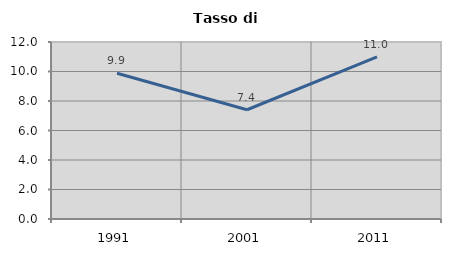
| Category | Tasso di disoccupazione   |
|---|---|
| 1991.0 | 9.884 |
| 2001.0 | 7.407 |
| 2011.0 | 10.989 |